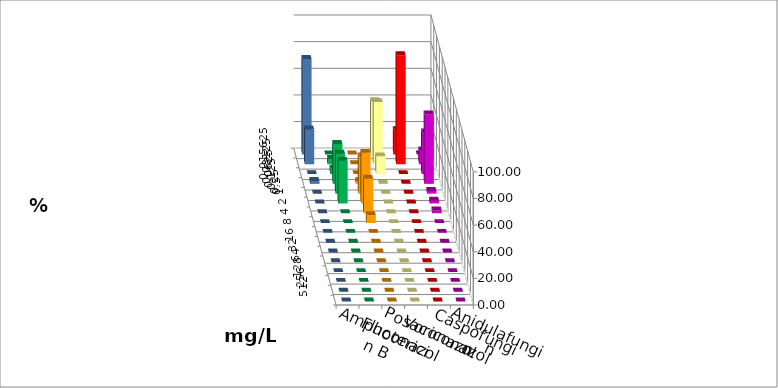
| Category | Amphotericin B | Fluconazol | Posaconazol | Voriconazol | Caspofungin | Anidulafungin |
|---|---|---|---|---|---|---|
| 0.015625 | 0 | 0 | 40 | 18.182 | 0 | 71.739 |
| 0.03125 | 4 | 0 | 46.667 | 81.818 | 10.417 | 26.087 |
| 0.0625 | 4 | 0 | 13.333 | 0 | 31.25 | 0 |
| 0.125 | 30 | 2 | 0 | 0 | 52.083 | 2.174 |
| 0.25 | 30 | 28 | 0 | 0 | 2.083 | 0 |
| 0.5 | 32 | 38 | 0 | 0 | 2.083 | 0 |
| 1.0 | 0 | 26 | 0 | 0 | 2.083 | 0 |
| 2.0 | 0 | 6 | 0 | 0 | 0 | 0 |
| 4.0 | 0 | 0 | 0 | 0 | 0 | 0 |
| 8.0 | 0 | 0 | 0 | 0 | 0 | 0 |
| 16.0 | 0 | 0 | 0 | 0 | 0 | 0 |
| 32.0 | 0 | 0 | 0 | 0 | 0 | 0 |
| 64.0 | 0 | 0 | 0 | 0 | 0 | 0 |
| 128.0 | 0 | 0 | 0 | 0 | 0 | 0 |
| 256.0 | 0 | 0 | 0 | 0 | 0 | 0 |
| 512.0 | 0 | 0 | 0 | 0 | 0 | 0 |